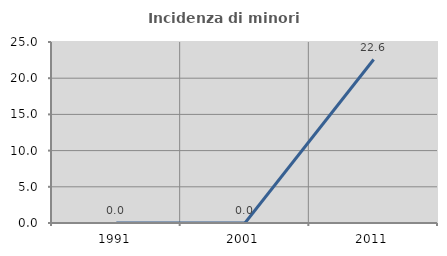
| Category | Incidenza di minori stranieri |
|---|---|
| 1991.0 | 0 |
| 2001.0 | 0 |
| 2011.0 | 22.581 |